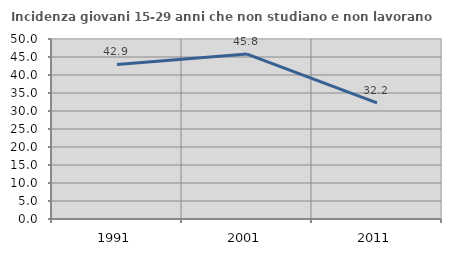
| Category | Incidenza giovani 15-29 anni che non studiano e non lavorano  |
|---|---|
| 1991.0 | 42.936 |
| 2001.0 | 45.82 |
| 2011.0 | 32.236 |